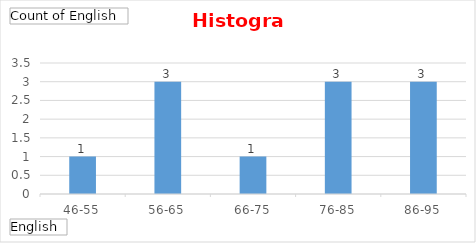
| Category | Total |
|---|---|
| 46-55 | 1 |
| 56-65 | 3 |
| 66-75 | 1 |
| 76-85 | 3 |
| 86-95 | 3 |